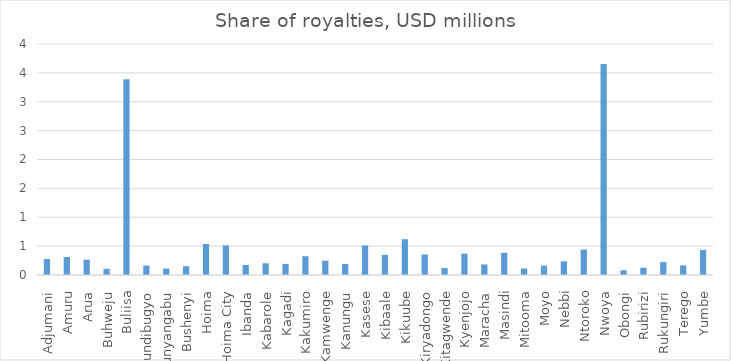
| Category | Series 0 |
|---|---|
| Adjumani | 0.278 |
| Amuru | 0.311 |
| Arua | 0.265 |
| Buhweju | 0.107 |
| Buliisa | 3.388 |
| Bundibugyo | 0.163 |
| Bunyangabu | 0.112 |
| Bushenyi | 0.152 |
| Hoima | 0.537 |
| Hoima City | 0.513 |
| Ibanda | 0.174 |
| Kabarole | 0.203 |
| Kagadi | 0.192 |
| Kakumiro | 0.325 |
| Kamwenge | 0.247 |
| Kanungu | 0.192 |
| Kasese | 0.51 |
| Kibaale | 0.349 |
| Kikuube | 0.62 |
| Kiryadongo | 0.355 |
| Kitagwende | 0.12 |
| Kyenjojo | 0.37 |
| Maracha | 0.183 |
| Masindi | 0.385 |
| Mitooma | 0.112 |
| Moyo | 0.162 |
| Nebbi | 0.237 |
| Ntoroko | 0.441 |
| Nwoya | 3.652 |
| Obongi | 0.082 |
| Rubirizi | 0.127 |
| Rukungiri | 0.223 |
| Terego | 0.165 |
| Yumbe | 0.436 |